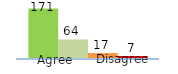
| Category | Series 0 | Series 1 | Series 2 | Series 3 |
|---|---|---|---|---|
| 0 | 171 | 64 | 17 | 7 |